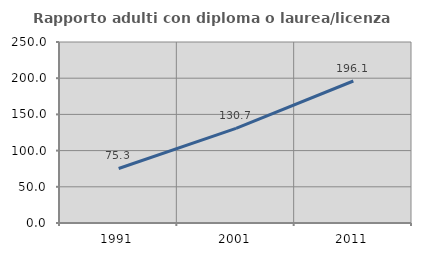
| Category | Rapporto adulti con diploma o laurea/licenza media  |
|---|---|
| 1991.0 | 75.333 |
| 2001.0 | 130.723 |
| 2011.0 | 196.129 |